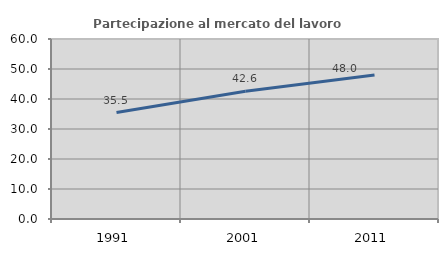
| Category | Partecipazione al mercato del lavoro  femminile |
|---|---|
| 1991.0 | 35.488 |
| 2001.0 | 42.556 |
| 2011.0 | 47.991 |